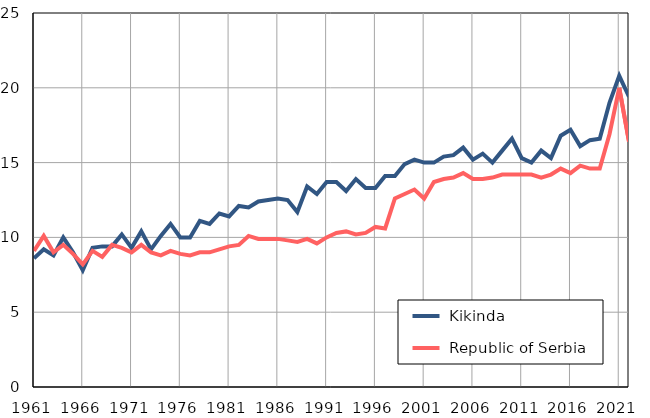
| Category |  Kikinda |  Republic of Serbia |
|---|---|---|
| 1961.0 | 8.6 | 9.1 |
| 1962.0 | 9.2 | 10.1 |
| 1963.0 | 8.8 | 9 |
| 1964.0 | 10 | 9.5 |
| 1965.0 | 9 | 8.9 |
| 1966.0 | 7.8 | 8.2 |
| 1967.0 | 9.3 | 9.1 |
| 1968.0 | 9.4 | 8.7 |
| 1969.0 | 9.4 | 9.5 |
| 1970.0 | 10.2 | 9.3 |
| 1971.0 | 9.3 | 9 |
| 1972.0 | 10.4 | 9.5 |
| 1973.0 | 9.2 | 9 |
| 1974.0 | 10.1 | 8.8 |
| 1975.0 | 10.9 | 9.1 |
| 1976.0 | 10 | 8.9 |
| 1977.0 | 10 | 8.8 |
| 1978.0 | 11.1 | 9 |
| 1979.0 | 10.9 | 9 |
| 1980.0 | 11.6 | 9.2 |
| 1981.0 | 11.4 | 9.4 |
| 1982.0 | 12.1 | 9.5 |
| 1983.0 | 12 | 10.1 |
| 1984.0 | 12.4 | 9.9 |
| 1985.0 | 12.5 | 9.9 |
| 1986.0 | 12.6 | 9.9 |
| 1987.0 | 12.5 | 9.8 |
| 1988.0 | 11.7 | 9.7 |
| 1989.0 | 13.4 | 9.9 |
| 1990.0 | 12.9 | 9.6 |
| 1991.0 | 13.7 | 10 |
| 1992.0 | 13.7 | 10.3 |
| 1993.0 | 13.1 | 10.4 |
| 1994.0 | 13.9 | 10.2 |
| 1995.0 | 13.3 | 10.3 |
| 1996.0 | 13.3 | 10.7 |
| 1997.0 | 14.1 | 10.6 |
| 1998.0 | 14.1 | 12.6 |
| 1999.0 | 14.9 | 12.9 |
| 2000.0 | 15.2 | 13.2 |
| 2001.0 | 15 | 12.6 |
| 2002.0 | 15 | 13.7 |
| 2003.0 | 15.4 | 13.9 |
| 2004.0 | 15.5 | 14 |
| 2005.0 | 16 | 14.3 |
| 2006.0 | 15.2 | 13.9 |
| 2007.0 | 15.6 | 13.9 |
| 2008.0 | 15 | 14 |
| 2009.0 | 15.8 | 14.2 |
| 2010.0 | 16.6 | 14.2 |
| 2011.0 | 15.3 | 14.2 |
| 2012.0 | 15 | 14.2 |
| 2013.0 | 15.8 | 14 |
| 2014.0 | 15.3 | 14.2 |
| 2015.0 | 16.8 | 14.6 |
| 2016.0 | 17.2 | 14.3 |
| 2017.0 | 16.1 | 14.8 |
| 2018.0 | 16.5 | 14.6 |
| 2019.0 | 16.6 | 14.6 |
| 2020.0 | 19 | 16.9 |
| 2021.0 | 20.8 | 20 |
| 2022.0 | 19.4 | 16.4 |